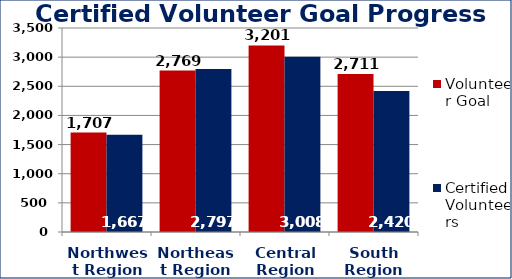
| Category | Volunteer Goal  | Certified Volunteers  |
|---|---|---|
| Northwest Region | 1707 | 1667 |
| Northeast Region | 2769 | 2797 |
| Central Region | 3201 | 3008 |
| South Region | 2711 | 2420 |